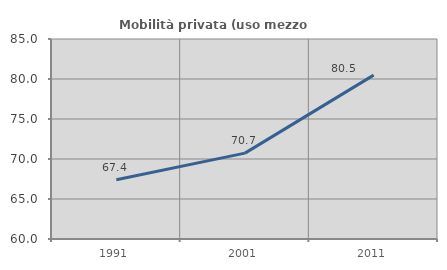
| Category | Mobilità privata (uso mezzo privato) |
|---|---|
| 1991.0 | 67.407 |
| 2001.0 | 70.732 |
| 2011.0 | 80.488 |